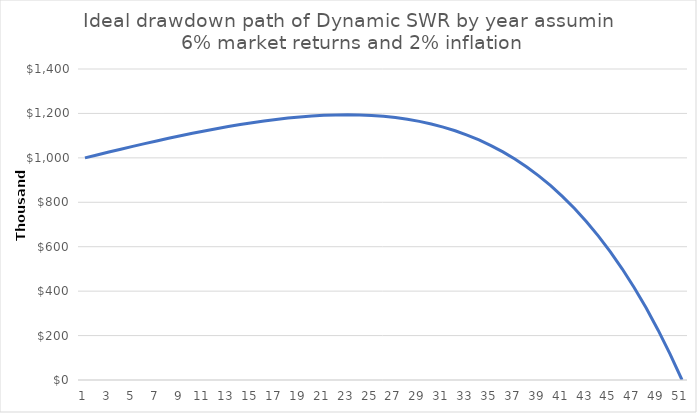
| Category | Savings |
|---|---|
| 0 | 1000000 |
| 1 | 1013155 |
| 2 | 1026162 |
| 3 | 1038994 |
| 4 | 1051622 |
| 5 | 1064012 |
| 6 | 1076132 |
| 7 | 1087945 |
| 8 | 1099411 |
| 9 | 1110490 |
| 10 | 1121135 |
| 11 | 1131299 |
| 12 | 1140931 |
| 13 | 1149976 |
| 14 | 1158375 |
| 15 | 1166067 |
| 16 | 1172983 |
| 17 | 1179054 |
| 18 | 1184203 |
| 19 | 1188349 |
| 20 | 1191405 |
| 21 | 1193280 |
| 22 | 1193875 |
| 23 | 1193086 |
| 24 | 1190801 |
| 25 | 1186902 |
| 26 | 1181262 |
| 27 | 1173746 |
| 28 | 1164212 |
| 29 | 1152506 |
| 30 | 1138467 |
| 31 | 1121921 |
| 32 | 1102686 |
| 33 | 1080566 |
| 34 | 1055353 |
| 35 | 1026826 |
| 36 | 994750 |
| 37 | 958876 |
| 38 | 918939 |
| 39 | 874656 |
| 40 | 825728 |
| 41 | 771836 |
| 42 | 712641 |
| 43 | 647785 |
| 44 | 576885 |
| 45 | 499536 |
| 46 | 415307 |
| 47 | 323740 |
| 48 | 224349 |
| 49 | 116618 |
| 50 | 0 |